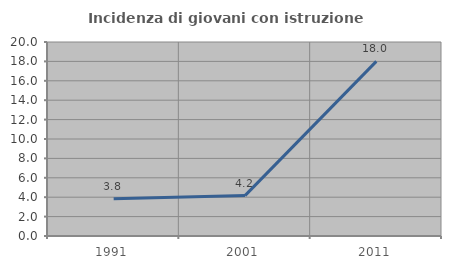
| Category | Incidenza di giovani con istruzione universitaria |
|---|---|
| 1991.0 | 3.846 |
| 2001.0 | 4.167 |
| 2011.0 | 18 |